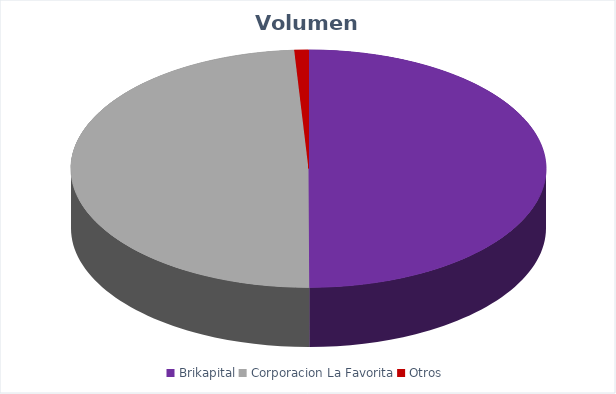
| Category | VOLUMEN ($USD) |
|---|---|
| Brikapital | 690000 |
| Corporacion La Favorita | 678061.22 |
| Otros | 13230 |